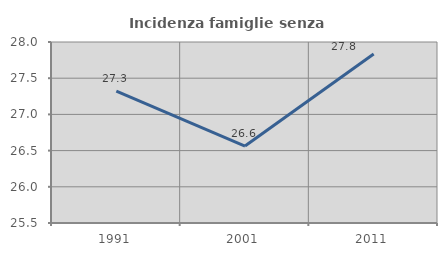
| Category | Incidenza famiglie senza nuclei |
|---|---|
| 1991.0 | 27.322 |
| 2001.0 | 26.562 |
| 2011.0 | 27.835 |